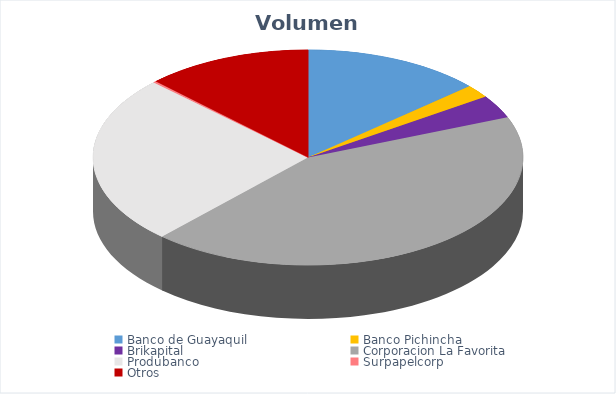
| Category | VOLUMEN ($USD) |
|---|---|
| Banco de Guayaquil | 19420.5 |
| Banco Pichincha | 2800 |
| Brikapital | 5000 |
| Corporacion La Favorita | 61871.16 |
| Produbanco | 36599.04 |
| Surpapelcorp | 340 |
| Otros | 18000 |